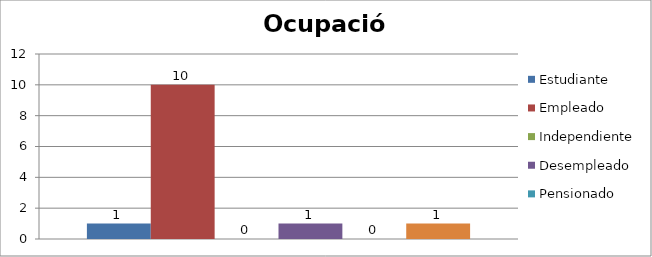
| Category | Estudiante | Empleado | Independiente | Desempleado  | Pensionado | Ama de casa |
|---|---|---|---|---|---|---|
| 0 | 1 | 10 | 0 | 1 | 0 | 1 |